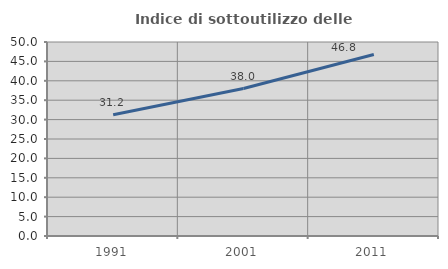
| Category | Indice di sottoutilizzo delle abitazioni  |
|---|---|
| 1991.0 | 31.229 |
| 2001.0 | 38.009 |
| 2011.0 | 46.76 |